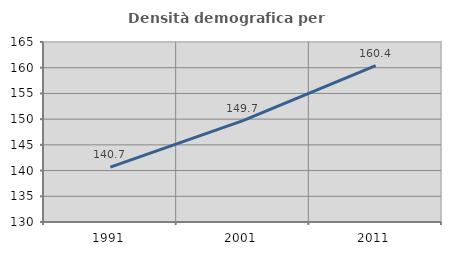
| Category | Densità demografica |
|---|---|
| 1991.0 | 140.677 |
| 2001.0 | 149.716 |
| 2011.0 | 160.405 |